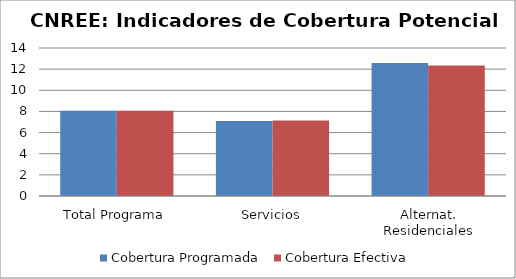
| Category | Cobertura Programada | Cobertura Efectiva |
|---|---|---|
| Total Programa | 8.063 | 8.065 |
| Servicios | 7.098 | 7.153 |
| Alternat. Residenciales | 12.592 | 12.347 |